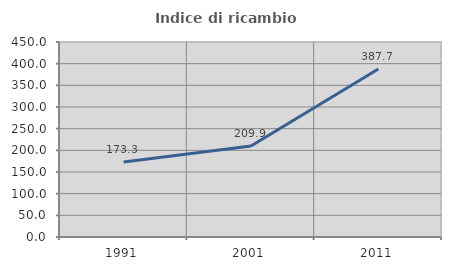
| Category | Indice di ricambio occupazionale  |
|---|---|
| 1991.0 | 173.272 |
| 2001.0 | 209.917 |
| 2011.0 | 387.671 |